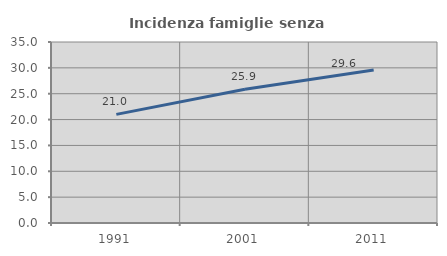
| Category | Incidenza famiglie senza nuclei |
|---|---|
| 1991.0 | 21.008 |
| 2001.0 | 25.875 |
| 2011.0 | 29.572 |